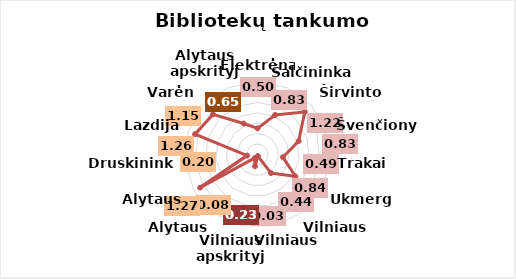
| Category | Series 0 |
|---|---|
| Elektrėnai | 0.5 |
| Šalčininkai | 0.83 |
| Širvintos | 1.22 |
| Švenčionys | 0.83 |
| Trakai | 0.49 |
| Ukmergė | 0.84 |
| Vilniaus r. | 0.44 |
| Vilniaus m. | 0.03 |
| Vilniaus apskrityje | 0.23 |
| Alytaus m. | 0.08 |
| Alytaus r. | 1.27 |
| Druskininkai | 0.2 |
| Lazdijai | 1.26 |
| Varėna | 1.15 |
| Alytaus apskrityje | 0.65 |